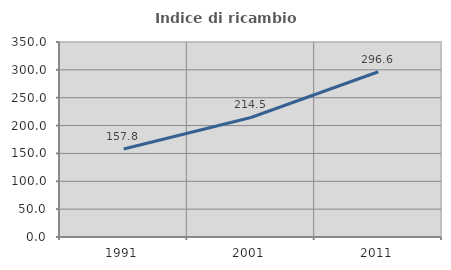
| Category | Indice di ricambio occupazionale  |
|---|---|
| 1991.0 | 157.812 |
| 2001.0 | 214.525 |
| 2011.0 | 296.629 |